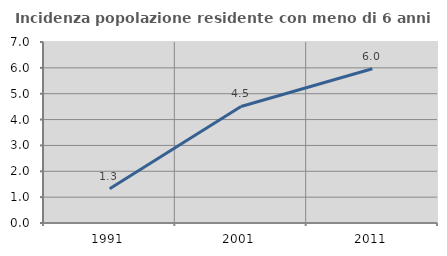
| Category | Incidenza popolazione residente con meno di 6 anni |
|---|---|
| 1991.0 | 1.322 |
| 2001.0 | 4.506 |
| 2011.0 | 5.964 |